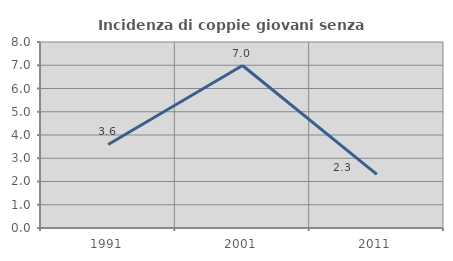
| Category | Incidenza di coppie giovani senza figli |
|---|---|
| 1991.0 | 3.593 |
| 2001.0 | 6.989 |
| 2011.0 | 2.304 |